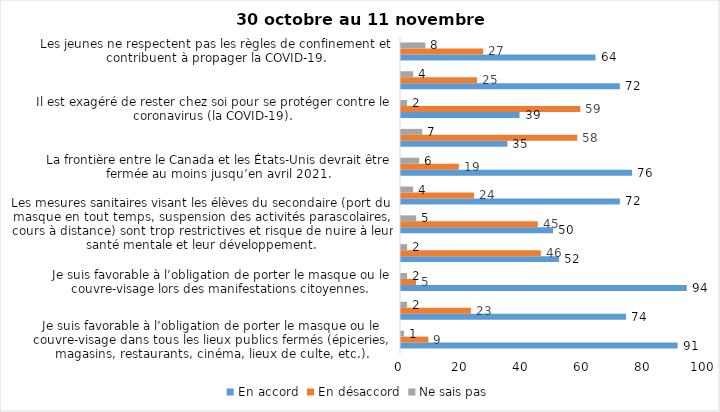
| Category | En accord | En désaccord | Ne sais pas |
|---|---|---|---|
| Je suis favorable à l’obligation de porter le masque ou le couvre-visage dans tous les lieux publics fermés (épiceries, magasins, restaurants, cinéma, lieux de culte, etc.). | 91 | 9 | 1 |
| C’est une bonne chose que les policiers puissent donner facilement des contraventions aux gens qui ne respectent pas les mesures pour prévenir le coronavirus (la COVID-19). | 74 | 23 | 2 |
| Je suis favorable à l’obligation de porter le masque ou le couvre-visage lors des manifestations citoyennes. | 94 | 5 | 2 |
| C’est une bonne chose d’arrêter les activités sportives de groupe (ex. hockey, soccer, yoga, etc.) et de fermer les centres d’entraînement (gyms) dans les zones rouges. | 52 | 46 | 2 |
| Les mesures sanitaires visant les élèves du secondaire (port du masque en tout temps, suspension des activités parascolaires, cours à distance) sont trop restrictives et risque de nuire à leur santé mentale et leur développement. | 50 | 45 | 5 |
| Je suis favorable à l’obligation de porter le masque ou le couvre-visage en tout temps pour les élèves au secondaire. | 72 | 24 | 4 |
| La frontière entre le Canada et les États-Unis devrait être fermée au moins jusqu’en avril 2021. | 76 | 19 | 6 |
| Le gouvernement et les médias exagèrent par rapport au coronavirus (la COVID-19). | 35 | 58 | 7 |
| Il est exagéré de rester chez soi pour se protéger contre le coronavirus (la COVID-19). | 39 | 59 | 2 |
| J’ai peur que le système de santé soit débordé par les cas de COVID-19 suite au «déconfinement». | 72 | 25 | 4 |
| Les jeunes ne respectent pas les règles de confinement et contribuent à propager la COVID-19. | 64 | 27 | 8 |